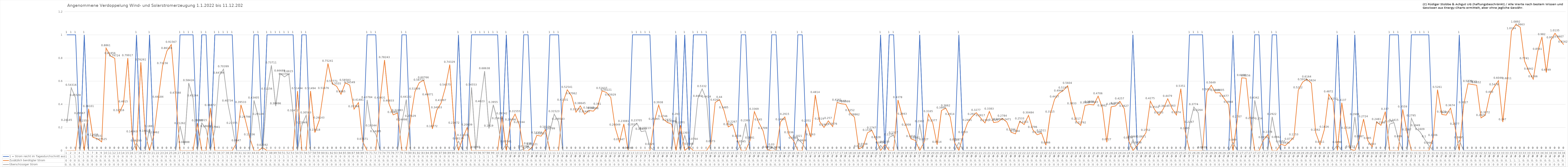
| Category | 1 = Strom reicht im Tagesdurchschnitt aus | Zusätzlich benötigter Strom | Überschüssiger Strom |
|---|---|---|---|
| 0 | 1 | 0 | 0.241 |
| 1 | 1 | 0 | 0.543 |
| 2 | 1 | 0 | 0.455 |
| 3 | 0 | 0.3 | 0 |
| 4 | 1 | 0 | 0.236 |
| 5 | 0 | 0.361 | 0 |
| 6 | 0 | 0.114 | 0 |
| 7 | 0 | 0.103 | 0 |
| 8 | 0 | 0.075 | 0 |
| 9 | 0 | 0.886 | 0 |
| 10 | 0 | 0.819 | 0 |
| 11 | 0 | 0.797 | 0 |
| 12 | 0 | 0.325 | 0 |
| 13 | 0 | 0.402 | 0 |
| 14 | 0 | 0.799 | 0 |
| 15 | 0 | 0.141 | 0 |
| 16 | 1 | 0 | 0.063 |
| 17 | 0 | 0.763 | 0 |
| 18 | 0 | 0.146 | 0 |
| 19 | 1 | 0 | 0.188 |
| 20 | 0 | 0.135 | 0 |
| 21 | 0 | 0.442 | 0 |
| 22 | 0 | 0.732 | 0 |
| 23 | 0 | 0.861 | 0 |
| 24 | 0 | 0.916 | 0 |
| 25 | 0 | 0.475 | 0 |
| 26 | 1 | 0 | 0.213 |
| 27 | 1 | 0 | 0.049 |
| 28 | 1 | 0 | 0.584 |
| 29 | 1 | 0 | 0.452 |
| 30 | 0 | 0.238 | 0 |
| 31 | 1 | 0 | 0.239 |
| 32 | 1 | 0 | 0.187 |
| 33 | 0 | 0.369 | 0 |
| 34 | 1 | 0 | 0.179 |
| 35 | 1 | 0 | 0.648 |
| 36 | 1 | 0 | 0.704 |
| 37 | 1 | 0 | 0.407 |
| 38 | 1 | 0 | 0.216 |
| 39 | 0 | 0.065 | 0 |
| 40 | 0 | 0.395 | 0 |
| 41 | 0 | 0.268 | 0 |
| 42 | 0 | 0.115 | 0 |
| 43 | 1 | 0 | 0.434 |
| 44 | 1 | 0 | 0.291 |
| 45 | 0 | 0.026 | 0 |
| 46 | 1 | 0 | 0.512 |
| 47 | 1 | 0 | 0.737 |
| 48 | 1 | 0 | 0.385 |
| 49 | 1 | 0 | 0.667 |
| 50 | 1 | 0 | 0.637 |
| 51 | 1 | 0 | 0.661 |
| 52 | 1 | 0 | 0.324 |
| 53 | 0 | 0.515 | 0 |
| 54 | 1 | 0 | 0.219 |
| 55 | 1 | 0 | 0.306 |
| 56 | 0 | 0.515 | 0 |
| 57 | 0 | 0.156 | 0 |
| 58 | 0 | 0.261 | 0 |
| 59 | 0 | 0.517 | 0 |
| 60 | 0 | 0.752 | 0 |
| 61 | 0 | 0.578 | 0 |
| 62 | 0 | 0.556 | 0 |
| 63 | 0 | 0.487 | 0 |
| 64 | 0 | 0.586 | 0 |
| 65 | 0 | 0.565 | 0 |
| 66 | 0 | 0.358 | 0 |
| 67 | 0 | 0.415 | 0 |
| 68 | 0 | 0.077 | 0 |
| 69 | 1 | 0 | 0.438 |
| 70 | 1 | 0 | 0.193 |
| 71 | 1 | 0 | 0.143 |
| 72 | 0 | 0.434 | 0 |
| 73 | 0 | 0.782 | 0 |
| 74 | 0 | 0.408 | 0 |
| 75 | 0 | 0.309 | 0 |
| 76 | 0 | 0.325 | 0 |
| 77 | 1 | 0 | 0.245 |
| 78 | 1 | 0 | 0.441 |
| 79 | 0 | 0.276 | 0 |
| 80 | 0 | 0.51 | 0 |
| 81 | 0 | 0.587 | 0 |
| 82 | 0 | 0.608 | 0 |
| 83 | 0 | 0.461 | 0 |
| 84 | 0 | 0.188 | 0 |
| 85 | 0 | 0.349 | 0 |
| 86 | 0 | 0.411 | 0 |
| 87 | 0 | 0.546 | 0 |
| 88 | 0 | 0.743 | 0 |
| 89 | 0 | 0.217 | 0 |
| 90 | 1 | 0 | 0.081 |
| 91 | 0 | 0.11 | 0 |
| 92 | 0 | 0.2 | 0 |
| 93 | 1 | 0 | 0.546 |
| 94 | 1 | 0 | 0.006 |
| 95 | 1 | 0 | 0.402 |
| 96 | 1 | 0 | 0.686 |
| 97 | 1 | 0 | 0.192 |
| 98 | 1 | 0 | 0.396 |
| 99 | 1 | 0 | 0.256 |
| 100 | 0 | 0.297 | 0 |
| 101 | 1 | 0 | 0.055 |
| 102 | 0 | 0.245 | 0 |
| 103 | 0 | 0.316 | 0 |
| 104 | 0 | 0.222 | 0 |
| 105 | 1 | 0 | 0.013 |
| 106 | 1 | 0 | 0.038 |
| 107 | 0 | 0.031 | 0 |
| 108 | 0 | 0.132 | 0 |
| 109 | 0 | 0.125 | 0 |
| 110 | 0 | 0.181 | 0 |
| 111 | 1 | 0 | 0.168 |
| 112 | 1 | 0 | 0.315 |
| 113 | 1 | 0 | 0.25 |
| 114 | 0 | 0.415 | 0 |
| 115 | 0 | 0.525 | 0 |
| 116 | 0 | 0.471 | 0 |
| 117 | 0 | 0.332 | 0 |
| 118 | 0 | 0.386 | 0 |
| 119 | 0 | 0.314 | 0 |
| 120 | 0 | 0.346 | 0 |
| 121 | 0 | 0.341 | 0 |
| 122 | 0 | 0.381 | 0 |
| 123 | 0 | 0.516 | 0 |
| 124 | 0 | 0.502 | 0 |
| 125 | 0 | 0.459 | 0 |
| 126 | 0 | 0.2 | 0 |
| 127 | 0 | 0.073 | 0 |
| 128 | 0 | 0.231 | 0 |
| 129 | 0 | 0 | 0 |
| 130 | 1 | 0 | 0.202 |
| 131 | 1 | 0 | 0.237 |
| 132 | 1 | 0 | 0.164 |
| 133 | 1 | 0 | 0.171 |
| 134 | 1 | 0 | 0.033 |
| 135 | 0 | 0.251 | 0 |
| 136 | 0 | 0.394 | 0 |
| 137 | 0 | 0.275 | 0 |
| 138 | 0 | 0.243 | 0 |
| 139 | 0 | 0.229 | 0 |
| 140 | 1 | 0 | 0.293 |
| 141 | 0 | 0.22 | 0 |
| 142 | 1 | 0 | 0.13 |
| 143 | 0 | 0.035 | 0 |
| 144 | 1 | 0 | 0.076 |
| 145 | 1 | 0 | 0.449 |
| 146 | 1 | 0 | 0.533 |
| 147 | 1 | 0 | 0.442 |
| 148 | 0 | 0.057 | 0 |
| 149 | 0 | 0.416 | 0 |
| 150 | 0 | 0.44 | 0 |
| 151 | 0 | 0.348 | 0 |
| 152 | 0 | 0.205 | 0 |
| 153 | 0 | 0.227 | 0 |
| 154 | 0 | 0.104 | 0 |
| 155 | 1 | 0 | 0.054 |
| 156 | 1 | 0 | 0.237 |
| 157 | 0 | 0.088 | 0 |
| 158 | 0 | 0.337 | 0 |
| 159 | 0 | 0.245 | 0 |
| 160 | 0 | 0.171 | 0 |
| 161 | 0 | 0.007 | 0 |
| 162 | 1 | 0 | 0.03 |
| 163 | 1 | 0 | 0.004 |
| 164 | 0 | 0.247 | 0 |
| 165 | 0 | 0.292 | 0 |
| 166 | 0 | 0.134 | 0 |
| 167 | 0 | 0.087 | 0 |
| 168 | 1 | 0 | 0.102 |
| 169 | 1 | 0 | 0.064 |
| 170 | 0 | 0.235 | 0 |
| 171 | 0 | 0.116 | 0 |
| 172 | 0 | 0.481 | 0 |
| 173 | 0 | 0.252 | 0 |
| 174 | 0 | 0.2 | 0 |
| 175 | 0 | 0.257 | 0 |
| 176 | 0 | 0.208 | 0 |
| 177 | 0 | 0.416 | 0 |
| 178 | 0 | 0.405 | 0 |
| 179 | 0 | 0.4 | 0 |
| 180 | 0 | 0.325 | 0 |
| 181 | 0 | 0.289 | 0 |
| 182 | 0 | 0.015 | 0 |
| 183 | 0 | 0.034 | 0 |
| 184 | 0 | 0.154 | 0 |
| 185 | 0 | 0.175 | 0 |
| 186 | 0 | 0.093 | 0 |
| 187 | 1 | 0 | 0.046 |
| 188 | 0 | 0.053 | 0 |
| 189 | 1 | 0 | 0.115 |
| 190 | 1 | 0 | 0.133 |
| 191 | 0 | 0.438 | 0 |
| 192 | 0 | 0.294 | 0 |
| 193 | 0 | 0.201 | 0 |
| 194 | 0 | 0.102 | 0 |
| 195 | 0 | 0.088 | 0 |
| 196 | 1 | 0 | 0.23 |
| 197 | 0 | 0.073 | 0 |
| 198 | 0 | 0.316 | 0 |
| 199 | 0 | 0.238 | 0 |
| 200 | 0 | 0.051 | 0 |
| 201 | 0 | 0.347 | 0 |
| 202 | 0 | 0.366 | 0 |
| 203 | 0 | 0.291 | 0 |
| 204 | 0 | 0.071 | 0 |
| 205 | 1 | 0 | 0.071 |
| 206 | 0 | 0.135 | 0 |
| 207 | 0 | 0.24 | 0 |
| 208 | 0 | 0.292 | 0 |
| 209 | 0 | 0.328 | 0 |
| 210 | 0 | 0.282 | 0 |
| 211 | 0 | 0.239 | 0 |
| 212 | 0 | 0.338 | 0 |
| 213 | 0 | 0.243 | 0 |
| 214 | 0 | 0.248 | 0 |
| 215 | 0 | 0.278 | 0 |
| 216 | 0 | 0.247 | 0 |
| 217 | 0 | 0.159 | 0 |
| 218 | 0 | 0.144 | 0 |
| 219 | 0 | 0.253 | 0 |
| 220 | 0 | 0.225 | 0 |
| 221 | 0 | 0.305 | 0 |
| 222 | 0 | 0.18 | 0 |
| 223 | 0 | 0.137 | 0 |
| 224 | 0 | 0.151 | 0 |
| 225 | 0 | 0.047 | 0 |
| 226 | 0 | 0.311 | 0 |
| 227 | 0 | 0.444 | 0 |
| 228 | 0 | 0.495 | 0 |
| 229 | 0 | 0.52 | 0 |
| 230 | 0 | 0.56 | 0 |
| 231 | 0 | 0.383 | 0 |
| 232 | 0 | 0.252 | 0 |
| 233 | 0 | 0.218 | 0 |
| 234 | 0 | 0.391 | 0 |
| 235 | 0 | 0.399 | 0 |
| 236 | 0 | 0.394 | 0 |
| 237 | 0 | 0.471 | 0 |
| 238 | 0 | 0.366 | 0 |
| 239 | 0 | 0.073 | 0 |
| 240 | 0 | 0.378 | 0 |
| 241 | 0 | 0.386 | 0 |
| 242 | 0 | 0.426 | 0 |
| 243 | 0 | 0.363 | 0 |
| 244 | 0 | 0.088 | 0 |
| 245 | 1 | 0 | 0.097 |
| 246 | 0 | 0.046 | 0 |
| 247 | 0 | 0.097 | 0 |
| 248 | 0 | 0.155 | 0 |
| 249 | 0 | 0.428 | 0 |
| 250 | 0 | 0.353 | 0 |
| 251 | 0 | 0.305 | 0 |
| 252 | 0 | 0.361 | 0 |
| 253 | 0 | 0.448 | 0 |
| 254 | 0 | 0.363 | 0 |
| 255 | 0 | 0.307 | 0 |
| 256 | 0 | 0.535 | 0 |
| 257 | 0 | 0.169 | 0 |
| 258 | 1 | 0 | 0.225 |
| 259 | 1 | 0 | 0.377 |
| 260 | 1 | 0 | 0.326 |
| 261 | 1 | 0 | 0.003 |
| 262 | 0 | 0.505 | 0 |
| 263 | 0 | 0.565 | 0 |
| 264 | 0 | 0.499 | 0 |
| 265 | 0 | 0.5 | 0 |
| 266 | 0 | 0.448 | 0 |
| 267 | 0 | 0.397 | 0 |
| 268 | 1 | 0 | 0.069 |
| 269 | 0 | 0.271 | 0 |
| 270 | 0 | 0.629 | 0 |
| 271 | 0 | 0.626 | 0 |
| 272 | 0 | 0.257 | 0 |
| 273 | 1 | 0 | 0.434 |
| 274 | 1 | 0 | 0.254 |
| 275 | 0 | 0.092 | 0 |
| 276 | 0 | 0.138 | 0 |
| 277 | 1 | 0 | 0.292 |
| 278 | 1 | 0 | 0.094 |
| 279 | 0 | 0.056 | 0 |
| 280 | 0 | 0.043 | 0 |
| 281 | 0 | 0.077 | 0 |
| 282 | 0 | 0.115 | 0 |
| 283 | 0 | 0.521 | 0 |
| 284 | 0 | 0.592 | 0 |
| 285 | 0 | 0.616 | 0 |
| 286 | 0 | 0.582 | 0 |
| 287 | 0 | 0.156 | 0 |
| 288 | 0 | 0.051 | 0 |
| 289 | 0 | 0.183 | 0 |
| 290 | 0 | 0.487 | 0 |
| 291 | 0 | 0.425 | 0 |
| 292 | 1 | 0 | 0.05 |
| 293 | 0 | 0.414 | 0 |
| 294 | 0 | 0.172 | 0 |
| 295 | 0 | 0.011 | 0 |
| 296 | 1 | 0 | 0.291 |
| 297 | 0 | 0.099 | 0 |
| 298 | 0 | 0.272 | 0 |
| 299 | 0 | 0.085 | 0 |
| 300 | 0 | 0.033 | 0 |
| 301 | 0 | 0.248 | 0 |
| 302 | 0 | 0.219 | 0 |
| 303 | 0 | 0.337 | 0 |
| 304 | 1 | 0 | 0.229 |
| 305 | 1 | 0 | 0.242 |
| 306 | 1 | 0 | 0.099 |
| 307 | 0 | 0.356 | 0 |
| 308 | 0 | 0.159 | 0 |
| 309 | 1 | 0 | 0.279 |
| 310 | 1 | 0 | 0.195 |
| 311 | 1 | 0 | 0.161 |
| 312 | 1 | 0 | 0.1 |
| 313 | 1 | 0 | 0.044 |
| 314 | 0 | 0.111 | 0 |
| 315 | 0 | 0.526 | 0 |
| 316 | 0 | 0.312 | 0 |
| 317 | 0 | 0.307 | 0 |
| 318 | 0 | 0.367 | 0 |
| 319 | 0 | 0.208 | 0 |
| 320 | 1 | 0 | 0.089 |
| 321 | 0 | 0.393 | 0 |
| 322 | 0 | 0.578 | 0 |
| 323 | 0 | 0.572 | 0 |
| 324 | 0 | 0.565 | 0 |
| 325 | 0 | 0.283 | 0 |
| 326 | 0 | 0.307 | 0 |
| 327 | 0 | 0.483 | 0 |
| 328 | 0 | 0.548 | 0 |
| 329 | 0 | 0.605 | 0 |
| 330 | 0 | 0.247 | 0 |
| 331 | 0 | 0.601 | 0 |
| 332 | 0 | 1.033 | 0 |
| 333 | 0 | 1.089 | 0 |
| 334 | 0 | 1.066 | 0 |
| 335 | 0 | 0.774 | 0 |
| 336 | 0 | 0.684 | 0 |
| 337 | 0 | 0.617 | 0 |
| 338 | 0 | 0.854 | 0 |
| 339 | 0 | 0.982 | 0 |
| 340 | 0 | 0.675 | 0 |
| 341 | 0 | 0.953 | 0 |
| 342 | 0 | 1.014 | 0 |
| 343 | 0 | 0.961 | 0 |
| 344 | 0 | 0.916 | 0 |